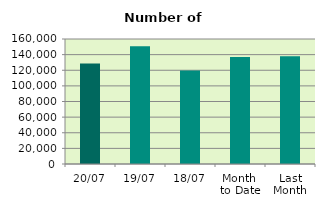
| Category | Series 0 |
|---|---|
| 20/07 | 128482 |
| 19/07 | 150624 |
| 18/07 | 119660 |
| Month 
to Date | 136912 |
| Last
Month | 138016.909 |